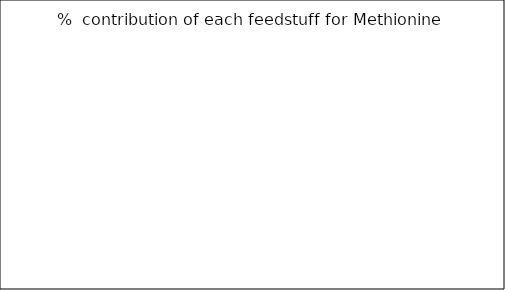
| Category | % of contribution off each feedstuff for Methionine |
|---|---|
| 0.0 | 0 |
| 0.0 | 0 |
| 0.0 | 0 |
| 0.0 | 0 |
| 0.0 | 0 |
| 0.0 | 0 |
| 0.0 | 0 |
| 0.0 | 0 |
| 0.0 | 0 |
| 0.0 | 0 |